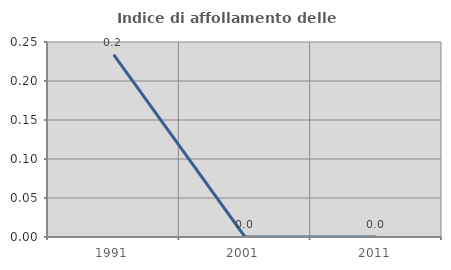
| Category | Indice di affollamento delle abitazioni  |
|---|---|
| 1991.0 | 0.234 |
| 2001.0 | 0 |
| 2011.0 | 0 |